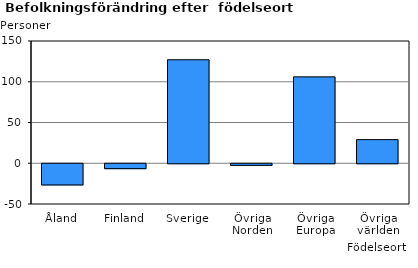
| Category | Series 0 |
|---|---|
| Åland | -26 |
| Finland | -6 |
| Sverige | 127 |
| Övriga Norden | -2 |
| Övriga Europa | 106 |
| Övriga världen | 29 |